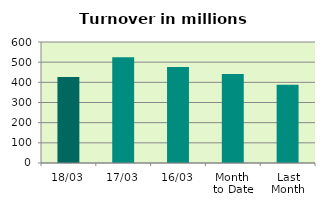
| Category | Series 0 |
|---|---|
| 18/03 | 426.014 |
| 17/03 | 524.293 |
| 16/03 | 475.494 |
| Month 
to Date | 441.83 |
| Last
Month | 387.65 |